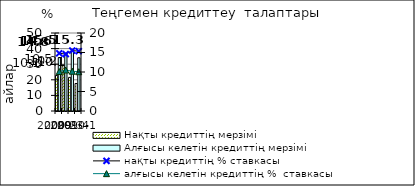
| Category | Нақты кредиттің мерзімі  | Алғысы келетін кредиттің мерзімі  |
|---|---|---|
| 2009-2 | 22.78 | 34.2 |
| 2009-3 | 29.58 | 37.04 |
| 2009-4 | 21.55 | 39.22 |
| 2010-1 | 17.64 | 34.13 |